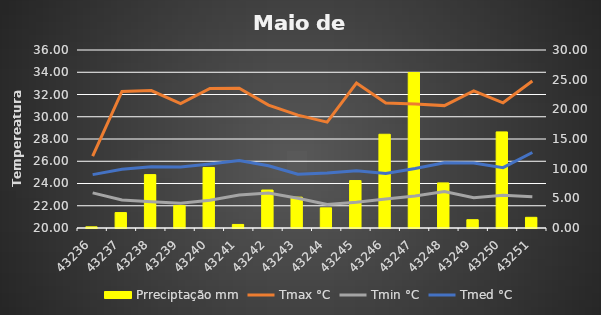
| Category | Prreciptação |
|---|---|
| 5/16/18 | 0.2 |
| 5/17/18 | 2.6 |
| 5/18/18 | 9 |
| 5/19/18 | 3.8 |
| 5/20/18 | 10.2 |
| 5/21/18 | 0.6 |
| 5/22/18 | 6.4 |
| 5/23/18 | 5.2 |
| 5/24/18 | 3.4 |
| 5/25/18 | 8 |
| 5/26/18 | 15.8 |
| 5/27/18 | 26.2 |
| 5/28/18 | 7.6 |
| 5/29/18 | 1.4 |
| 5/30/18 | 16.2 |
| 5/31/18 | 1.8 |